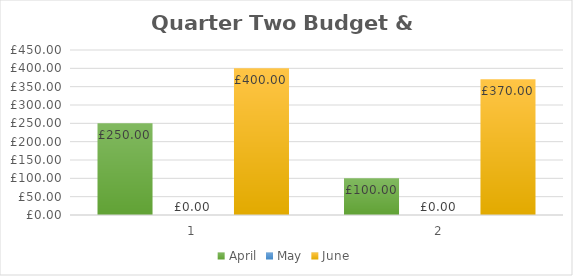
| Category | April | May | June |
|---|---|---|---|
| 0 | 250 | 0 | 400 |
| 1 | 100 | 0 | 370 |